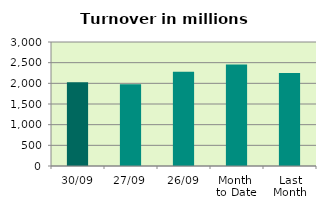
| Category | Series 0 |
|---|---|
| 30/09 | 2027.614 |
| 27/09 | 1974.851 |
| 26/09 | 2278.747 |
| Month 
to Date | 2458.207 |
| Last
Month | 2251.437 |